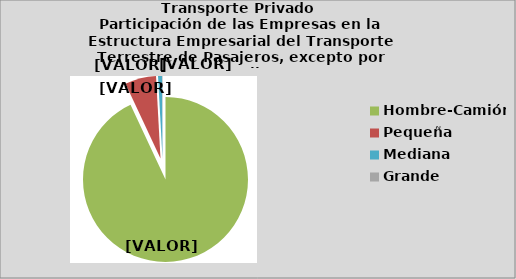
| Category | Series 0 |
|---|---|
| Hombre-Camión | 92.981 |
| Pequeña | 6.1 |
| Mediana | 0.78 |
| Grande | 0.087 |